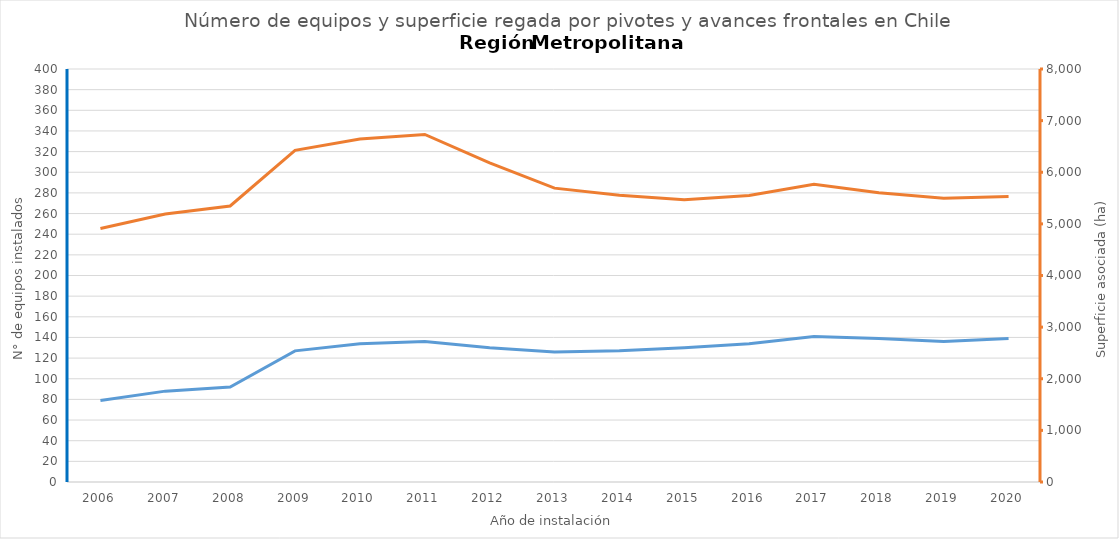
| Category | N° |
|---|---|
| 2006.0 | 79 |
| 2007.0 | 88 |
| 2008.0 | 92 |
| 2009.0 | 127 |
| 2010.0 | 134 |
| 2011.0 | 136 |
| 2012.0 | 130 |
| 2013.0 | 126 |
| 2014.0 | 127 |
| 2015.0 | 130 |
| 2016.0 | 134 |
| 2017.0 | 141 |
| 2018.0 | 139 |
| 2019.0 | 136 |
| 2020.0 | 139 |